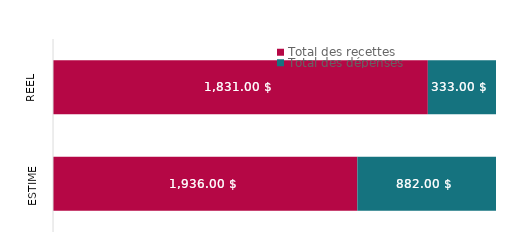
| Category | Total des recettes | Total des dépenses |
|---|---|---|
| Estimé | 1936 | 882 |
| Réel | 1831 | 333 |